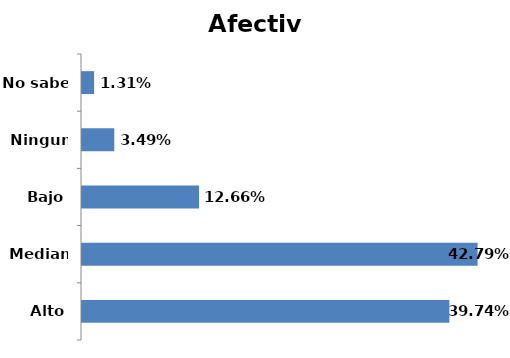
| Category | Series 0 |
|---|---|
| Alto | 0.397 |
| Mediano | 0.428 |
| Bajo | 0.127 |
| Ninguno | 0.035 |
| No sabe | 0.013 |